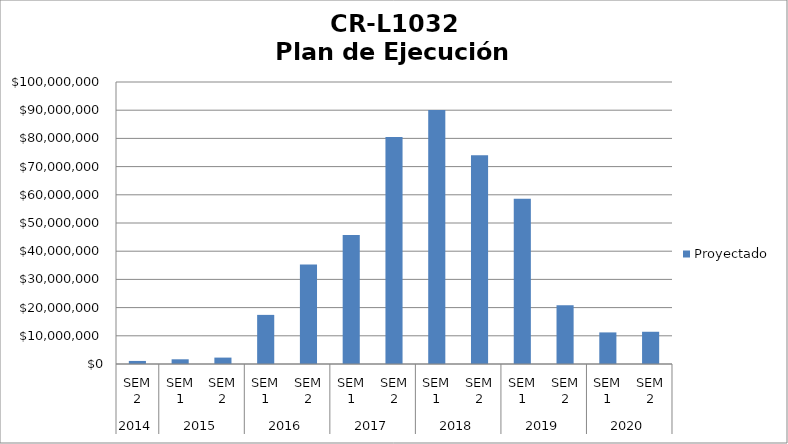
| Category | Proyectado |
|---|---|
| 0 | 1084711.538 |
| 1 | 1668056.154 |
| 2 | 2272126.154 |
| 3 | 17417881.793 |
| 4 | 35241333.598 |
| 5 | 45713074.281 |
| 6 | 80473758.339 |
| 7 | 90083430.763 |
| 8 | 74006400.741 |
| 9 | 58568785.621 |
| 10 | 20836105.124 |
| 11 | 11202821.793 |
| 12 | 11431514.101 |